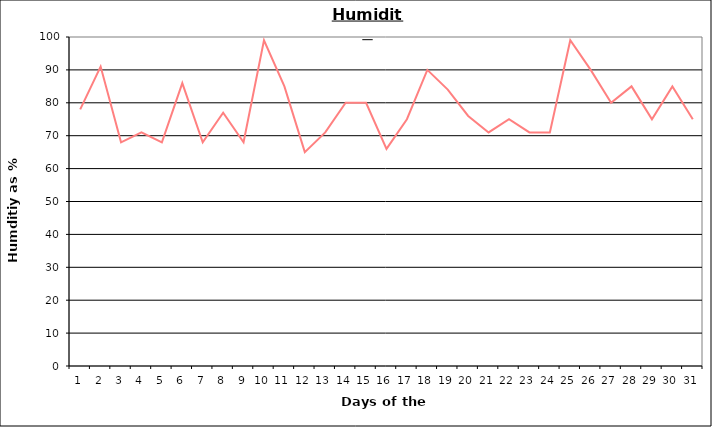
| Category | Series 0 |
|---|---|
| 0 | 78 |
| 1 | 91 |
| 2 | 68 |
| 3 | 71 |
| 4 | 68 |
| 5 | 86 |
| 6 | 68 |
| 7 | 77 |
| 8 | 68 |
| 9 | 99 |
| 10 | 85 |
| 11 | 65 |
| 12 | 71 |
| 13 | 80 |
| 14 | 80 |
| 15 | 66 |
| 16 | 75 |
| 17 | 90 |
| 18 | 84 |
| 19 | 76 |
| 20 | 71 |
| 21 | 75 |
| 22 | 71 |
| 23 | 71 |
| 24 | 99 |
| 25 | 90 |
| 26 | 80 |
| 27 | 85 |
| 28 | 75 |
| 29 | 85 |
| 30 | 75 |